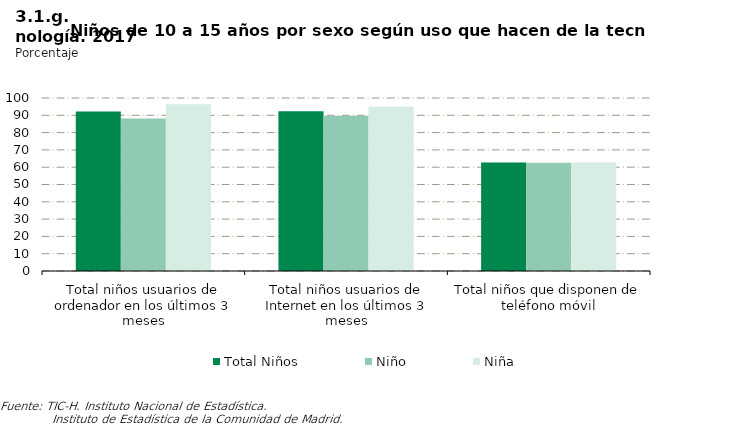
| Category | Total Niños | Niño | Niña |
|---|---|---|---|
| Total niños usuarios de ordenador en los últimos 3 meses | 92.167 | 88.202 | 96.342 |
| Total niños usuarios de Internet en los últimos 3 meses | 92.318 | 89.767 | 95.004 |
| Total niños que disponen de teléfono móvil | 62.672 | 62.595 | 62.753 |